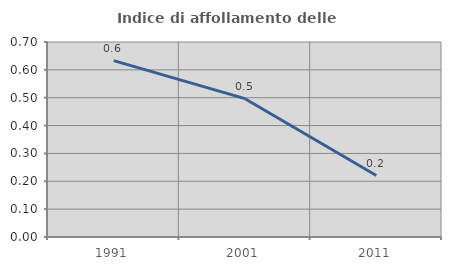
| Category | Indice di affollamento delle abitazioni  |
|---|---|
| 1991.0 | 0.633 |
| 2001.0 | 0.497 |
| 2011.0 | 0.221 |